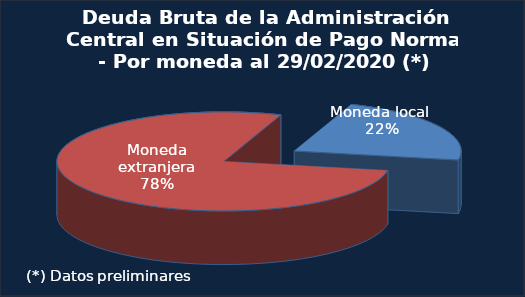
| Category | Series 0 |
|---|---|
| Moneda local (1) | 0.224 |
| Moneda extranjera | 0.776 |